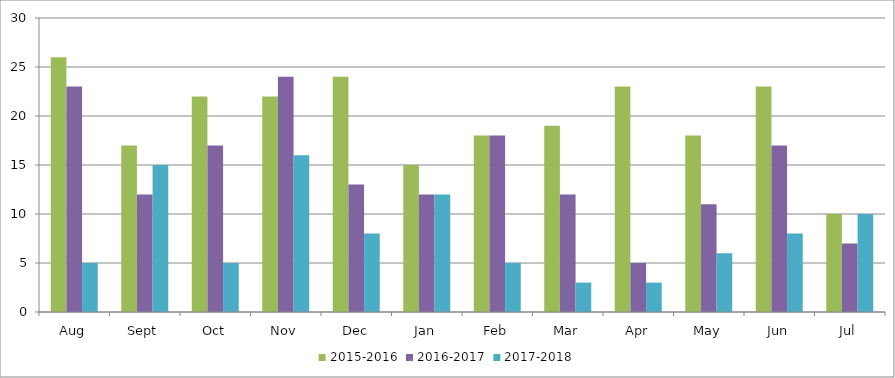
| Category | 2015-2016 | 2016-2017 | 2017-2018 |
|---|---|---|---|
| Aug | 26 | 23 | 5 |
| Sept | 17 | 12 | 15 |
| Oct | 22 | 17 | 5 |
| Nov | 22 | 24 | 16 |
| Dec | 24 | 13 | 8 |
| Jan | 15 | 12 | 12 |
| Feb | 18 | 18 | 5 |
| Mar | 19 | 12 | 3 |
| Apr | 23 | 5 | 3 |
| May | 18 | 11 | 6 |
| Jun | 23 | 17 | 8 |
| Jul | 10 | 7 | 10 |